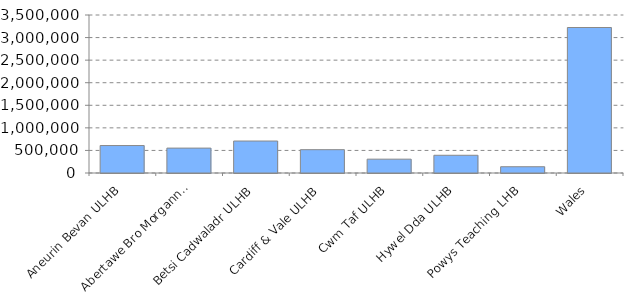
| Category | List size |
|---|---|
| Aneurin Bevan ULHB | 608274 |
| Abertawe Bro Morgannwg ULHB | 551533 |
| Betsi Cadwaladr ULHB | 708330 |
| Cardiff & Vale ULHB | 516603 |
| Cwm Taf ULHB | 306376 |
| Hywel Dda ULHB | 392690 |
| Powys Teaching LHB | 139086 |
| Wales | 3222892 |